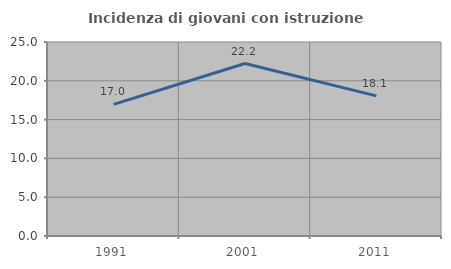
| Category | Incidenza di giovani con istruzione universitaria |
|---|---|
| 1991.0 | 16.964 |
| 2001.0 | 22.222 |
| 2011.0 | 18.056 |